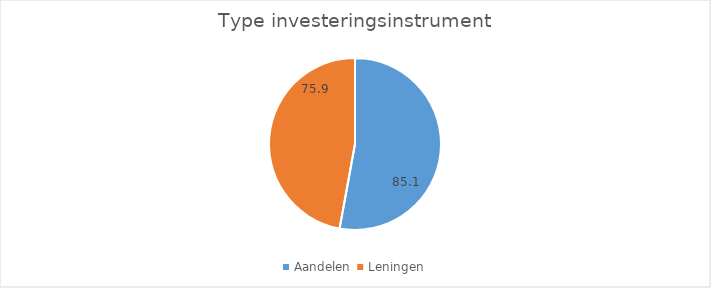
| Category | Series 0 |
|---|---|
| Aandelen  | 85.11 |
| Leningen | 75.868 |